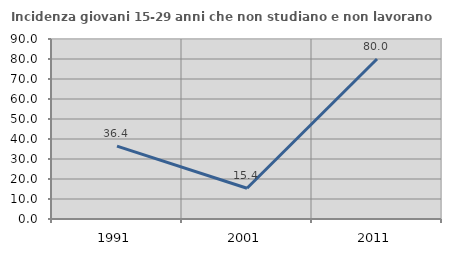
| Category | Incidenza giovani 15-29 anni che non studiano e non lavorano  |
|---|---|
| 1991.0 | 36.43 |
| 2001.0 | 15.385 |
| 2011.0 | 80 |